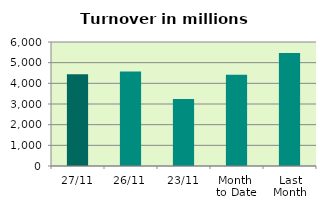
| Category | Series 0 |
|---|---|
| 27/11 | 4436.024 |
| 26/11 | 4572.805 |
| 23/11 | 3236.294 |
| Month 
to Date | 4417.726 |
| Last
Month | 5472.473 |